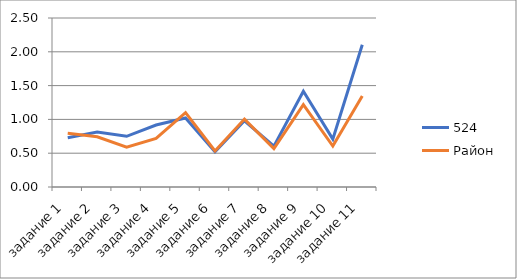
| Category | 524 | Район  |
|---|---|---|
| задание 1 | 0.729 | 0.794 |
| задание 2 | 0.812 | 0.743 |
| задание 3 | 0.75 | 0.59 |
| задание 4 | 0.917 | 0.719 |
| задание 5 | 1.021 | 1.101 |
| задание 6 | 0.521 | 0.533 |
| задание 7 | 0.979 | 1.005 |
| задание 8 | 0.604 | 0.569 |
| задание 9 | 1.417 | 1.217 |
| задание 10 | 0.708 | 0.606 |
| задание 11 | 2.104 | 1.346 |